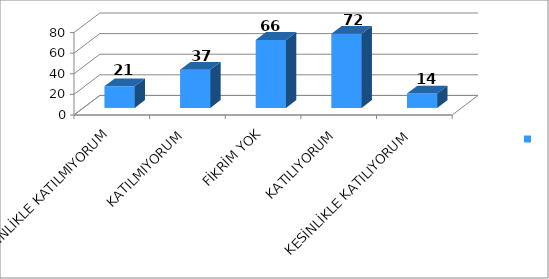
| Category | Series 0 |
|---|---|
| KESİNLİKLE KATILMIYORUM | 21 |
| KATILMIYORUM | 37 |
| FİKRİM YOK | 66 |
| KATILIYORUM | 72 |
| KESİNLİKLE KATILIYORUM | 14 |